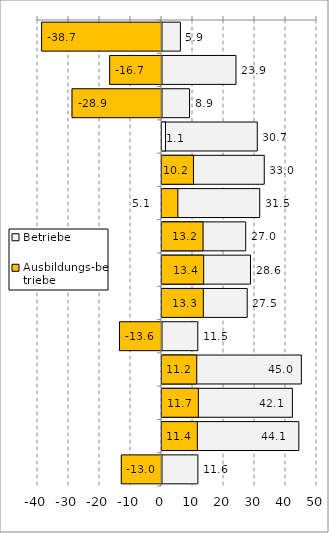
| Category | Betriebe | Ausbildungs-betriebe |
|---|---|---|
| 0 | 5.942 | -38.672 |
| 1 | 23.857 | -16.72 |
| 2 | 8.887 | -28.87 |
| 3 | 30.733 | 1.131 |
| 4 | 32.985 | 10.16 |
| 5 | 31.526 | 5.111 |
| 6 | 27.004 | 13.249 |
| 7 | 28.55 | 13.444 |
| 8 | 27.489 | 13.329 |
| 9 | 11.538 | -13.558 |
| 10 | 44.95 | 11.209 |
| 11 | 42.061 | 11.724 |
| 12 | 44.139 | 11.407 |
| 13 | 11.582 | -12.965 |